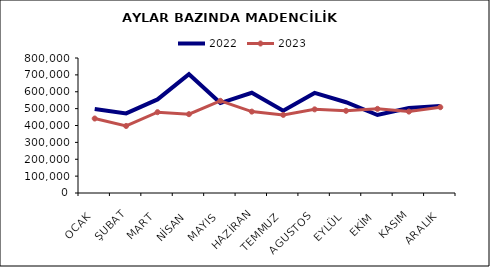
| Category | 2022 | 2023 |
|---|---|---|
| OCAK | 497849.896 | 441306.825 |
| ŞUBAT | 471704.263 | 397254.845 |
| MART | 554613.889 | 478851.45 |
| NİSAN | 704145.16 | 467165.446 |
| MAYIS | 533041.872 | 546205.852 |
| HAZİRAN | 594051.504 | 482339.122 |
| TEMMUZ | 487987.185 | 462882.704 |
| AGUSTOS | 593089.544 | 495647.42 |
| EYLÜL | 537861.994 | 487099.32 |
| EKİM | 462008.545 | 498679.89 |
| KASIM | 503422.248 | 482442.367 |
| ARALIK | 515319.926 | 508428.61 |